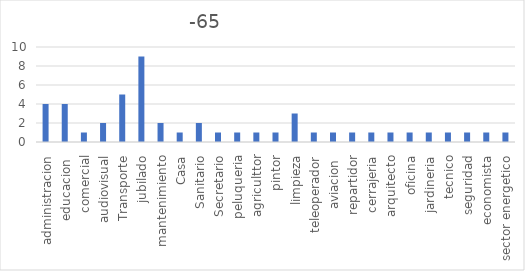
| Category | Series 0 |
|---|---|
| administracion | 4 |
| educacion  | 4 |
| comercial | 1 |
| audiovisual | 2 |
| Transporte | 5 |
| jubilado | 9 |
| mantenimiento | 2 |
| Casa | 1 |
| Sanitario | 2 |
| Secretario | 1 |
| peluqueria | 1 |
| agriculttor | 1 |
| pintor | 1 |
| limpieza | 3 |
| teleoperador | 1 |
| aviacion  | 1 |
| repartidor | 1 |
| cerrajeria | 1 |
| arquitecto | 1 |
| oficina | 1 |
| jardineria | 1 |
| tecnico | 1 |
| seguridad | 1 |
| economista | 1 |
| sector energetico | 1 |